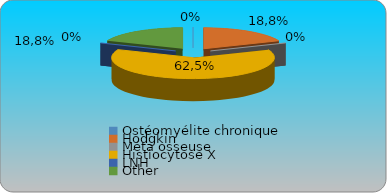
| Category | Series 0 | Series 1 | Series 2 | Series 3 |
|---|---|---|---|---|
| Ostéomyélite chronique | 0 |  |  |  |
| Hodgkin | 0.188 |  |  |  |
| Méta osseuse | 0 |  |  |  |
| Histiocytose X | 0.625 |  |  |  |
| LNH | 0 |  |  |  |
| Other  | 0.188 |  |  |  |